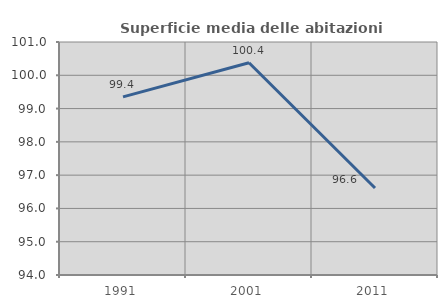
| Category | Superficie media delle abitazioni occupate |
|---|---|
| 1991.0 | 99.35 |
| 2001.0 | 100.378 |
| 2011.0 | 96.615 |